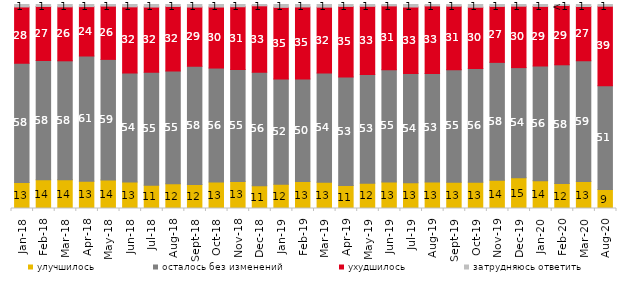
| Category | улучшилось | осталось без изменений | ухудшилось | затрудняюсь ответить |
|---|---|---|---|---|
| 2018-01-01 | 12.75 | 58.45 | 27.6 | 1.2 |
| 2018-02-01 | 14.1 | 58.4 | 26.55 | 0.95 |
| 2018-03-01 | 14.1 | 58.3 | 26.45 | 1.15 |
| 2018-04-01 | 13.35 | 61.4 | 24.2 | 1.05 |
| 2018-05-01 | 14 | 59.1 | 26.1 | 0.8 |
| 2018-06-01 | 12.95 | 53.5 | 32.4 | 1.15 |
| 2018-07-01 | 11.45 | 55.3 | 32 | 1.25 |
| 2018-08-01 | 12.1 | 55.25 | 31.7 | 0.95 |
| 2018-09-01 | 11.75 | 58 | 29 | 1.25 |
| 2018-10-01 | 12.95 | 55.9 | 29.9 | 1.25 |
| 2018-11-01 | 13.273 | 54.84 | 30.788 | 1.098 |
| 2018-12-01 | 11.2 | 55.6 | 32.55 | 0.65 |
| 2019-01-01 | 11.85 | 51.6 | 35.15 | 1.4 |
| 2019-02-01 | 13.2 | 50.3 | 35.3 | 1.2 |
| 2019-03-01 | 12.929 | 53.506 | 32.273 | 1.293 |
| 2019-04-01 | 11.238 | 53.168 | 34.653 | 0.941 |
| 2019-05-01 | 12.432 | 53.244 | 33.432 | 0.892 |
| 2019-06-01 | 13.017 | 54.963 | 31.322 | 0.698 |
| 2019-07-01 | 12.624 | 53.564 | 32.574 | 1.238 |
| 2019-08-01 | 12.937 | 53.197 | 33.167 | 0.699 |
| 2019-09-01 | 12.871 | 55.149 | 31.139 | 0.842 |
| 2019-10-01 | 12.921 | 55.693 | 30.05 | 1.337 |
| 2019-11-01 | 13.861 | 57.772 | 27.426 | 0.941 |
| 2019-12-01 | 15.099 | 53.96 | 30.099 | 0.842 |
| 2020-01-01 | 13.663 | 56.238 | 29.158 | 0.941 |
| 2020-02-01 | 12.228 | 58.218 | 29.059 | 0.495 |
| 2020-03-01 | 13.188 | 59.147 | 26.624 | 0.992 |
| 2020-08-01 | 9.285 | 50.943 | 38.928 | 0.844 |